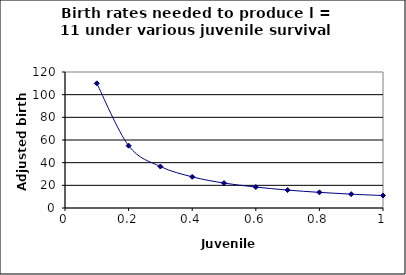
| Category | Series 0 |
|---|---|
| 0.1 | 110 |
| 0.2 | 55 |
| 0.30000000000000004 | 36.6 |
| 0.4 | 27.5 |
| 0.5 | 22 |
| 0.6 | 18.5 |
| 0.7 | 15.8 |
| 0.7999999999999999 | 13.8 |
| 0.8999999999999999 | 12.2 |
| 0.9999999999999999 | 11 |